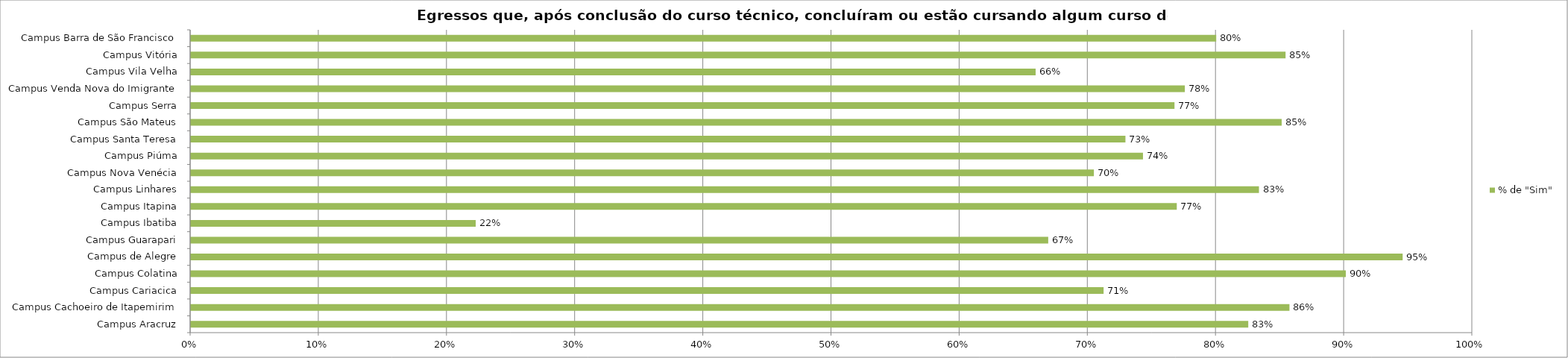
| Category | % de "Sim" |
|---|---|
| Campus Aracruz | 0.825 |
| Campus Cachoeiro de Itapemirim | 0.857 |
| Campus Cariacica | 0.712 |
| Campus Colatina | 0.901 |
| Campus de Alegre | 0.945 |
| Campus Guarapari | 0.669 |
| Campus Ibatiba | 0.222 |
| Campus Itapina | 0.769 |
| Campus Linhares | 0.833 |
| Campus Nova Venécia | 0.705 |
| Campus Piúma | 0.743 |
| Campus Santa Teresa | 0.729 |
| Campus São Mateus | 0.851 |
| Campus Serra | 0.767 |
| Campus Venda Nova do Imigrante | 0.776 |
| Campus Vila Velha | 0.659 |
| Campus Vitória | 0.854 |
| Campus Barra de São Francisco | 0.8 |